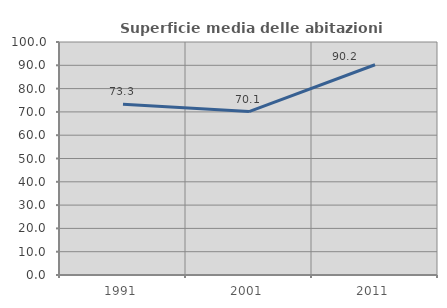
| Category | Superficie media delle abitazioni occupate |
|---|---|
| 1991.0 | 73.307 |
| 2001.0 | 70.13 |
| 2011.0 | 90.246 |